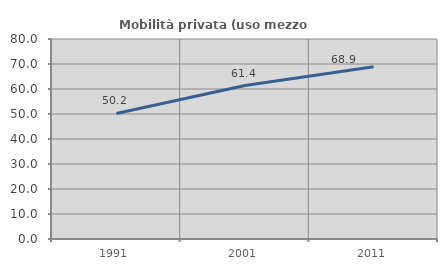
| Category | Mobilità privata (uso mezzo privato) |
|---|---|
| 1991.0 | 50.204 |
| 2001.0 | 61.383 |
| 2011.0 | 68.921 |